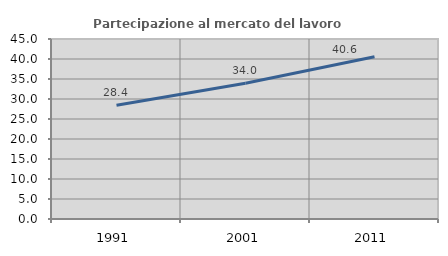
| Category | Partecipazione al mercato del lavoro  femminile |
|---|---|
| 1991.0 | 28.44 |
| 2001.0 | 33.953 |
| 2011.0 | 40.58 |